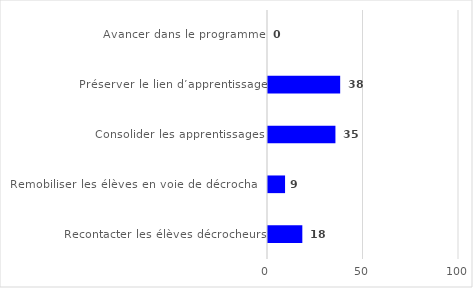
| Category | Series 0 |
|---|---|
| Avancer dans le programme | 0 |
| Préserver le lien d’apprentissage | 37.79 |
| Consolider les apprentissages | 35.305 |
| Remobiliser les élèves en voie de décrochage | 8.933 |
| Recontacter les élèves décrocheurs | 17.972 |